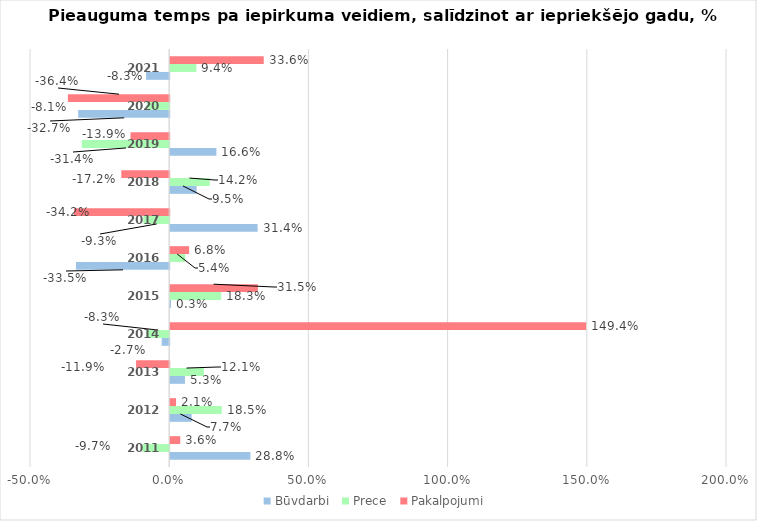
| Category | Būvdarbi | Prece | Pakalpojumi |
|---|---|---|---|
| 2011.0 | 0.288 | -0.097 | 0.036 |
| 2012.0 | 0.077 | 0.185 | 0.021 |
| 2013.0 | 0.053 | 0.121 | -0.119 |
| 2014.0 | -0.027 | -0.083 | 1.494 |
| 2015.0 | 0.003 | 0.183 | 0.315 |
| 2016.0 | -0.335 | 0.054 | 0.068 |
| 2017.0 | 0.314 | -0.093 | -0.342 |
| 2018.0 | 0.095 | 0.142 | -0.172 |
| 2019.0 | 0.166 | -0.314 | -0.139 |
| 2020.0 | -0.327 | -0.081 | -0.364 |
| 2021.0 | -0.083 | 0.094 | 0.336 |